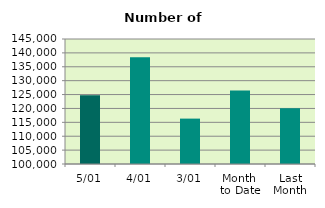
| Category | Series 0 |
|---|---|
| 5/01 | 124748 |
| 4/01 | 138412 |
| 3/01 | 116340 |
| Month 
to Date | 126500 |
| Last
Month | 120108.783 |